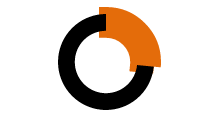
| Category | Series 0 |
|---|---|
| 0 | 0.265 |
| 1 | 0.735 |